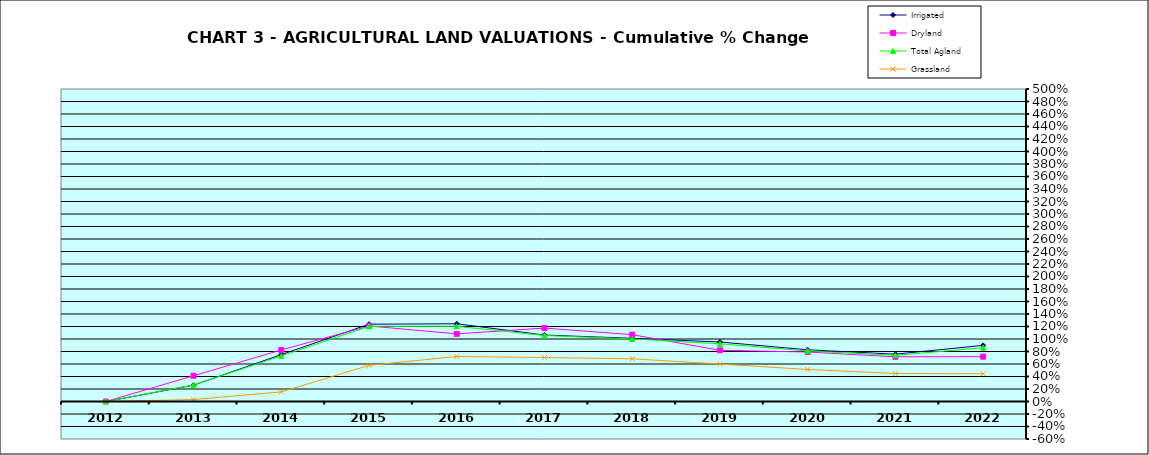
| Category | Irrigated | Dryland | Total Agland | Grassland |
|---|---|---|---|---|
| 2012.0 | 0 | 0 | 0 | 0 |
| 2013.0 | 0.261 | 0.412 | 0.265 | 0.032 |
| 2014.0 | 0.75 | 0.825 | 0.729 | 0.154 |
| 2015.0 | 1.237 | 1.208 | 1.203 | 0.578 |
| 2016.0 | 1.244 | 1.082 | 1.204 | 0.72 |
| 2017.0 | 1.063 | 1.175 | 1.056 | 0.704 |
| 2018.0 | 1.012 | 1.069 | 1.001 | 0.683 |
| 2019.0 | 0.952 | 0.819 | 0.923 | 0.599 |
| 2020.0 | 0.827 | 0.792 | 0.809 | 0.513 |
| 2021.0 | 0.758 | 0.715 | 0.739 | 0.448 |
| 2022.0 | 0.898 | 0.717 | 0.86 | 0.445 |